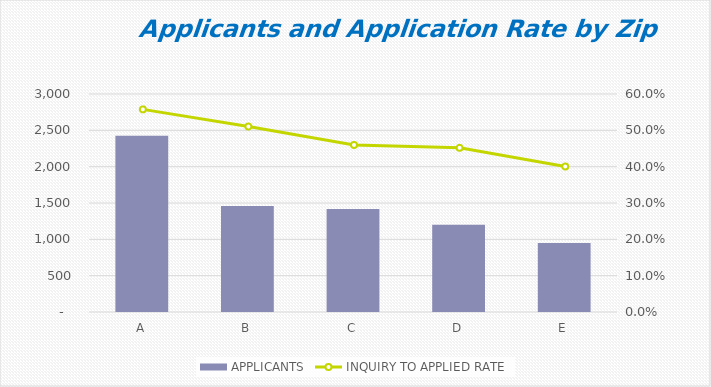
| Category | APPLICANTS |
|---|---|
| A | 2426 |
| B | 1460 |
| C | 1419 |
| D | 1199 |
| E | 949 |